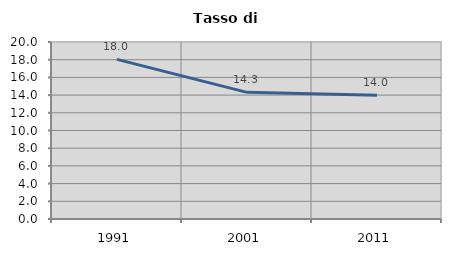
| Category | Tasso di disoccupazione   |
|---|---|
| 1991.0 | 18.035 |
| 2001.0 | 14.308 |
| 2011.0 | 13.987 |